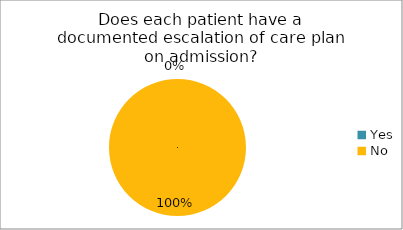
| Category | Does each patient have a documented escalation of care plan on admission? | Does each patient have a between the flags calling criteria documented on admission? |
|---|---|---|
| Yes | 0 | 0 |
| No | 1 | 1 |